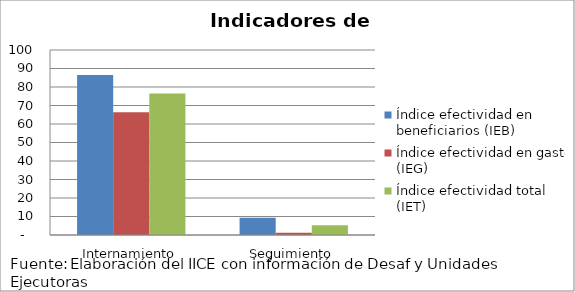
| Category | Índice efectividad en beneficiarios (IEB) | Índice efectividad en gasto (IEG)  | Índice efectividad total (IET) |
|---|---|---|---|
| Internamiento | 86.458 | 66.411 | 76.434 |
| Seguimiento | 9.375 | 1.149 | 5.262 |